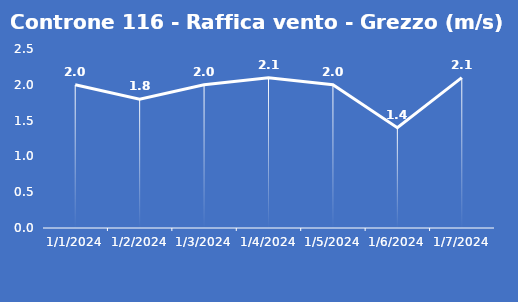
| Category | Controne 116 - Raffica vento - Grezzo (m/s) |
|---|---|
| 1/1/24 | 2 |
| 1/2/24 | 1.8 |
| 1/3/24 | 2 |
| 1/4/24 | 2.1 |
| 1/5/24 | 2 |
| 1/6/24 | 1.4 |
| 1/7/24 | 2.1 |